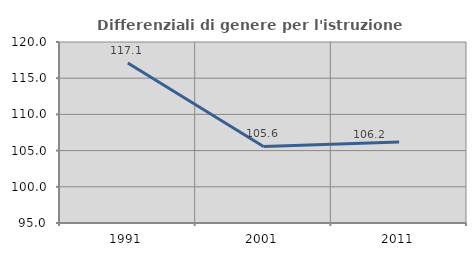
| Category | Differenziali di genere per l'istruzione superiore |
|---|---|
| 1991.0 | 117.09 |
| 2001.0 | 105.574 |
| 2011.0 | 106.191 |